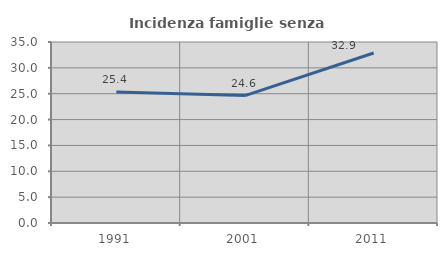
| Category | Incidenza famiglie senza nuclei |
|---|---|
| 1991.0 | 25.352 |
| 2001.0 | 24.636 |
| 2011.0 | 32.877 |